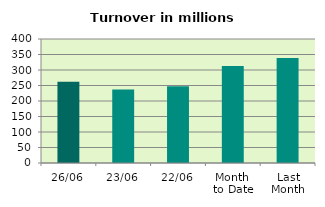
| Category | Series 0 |
|---|---|
| 26/06 | 262.001 |
| 23/06 | 237.398 |
| 22/06 | 247.332 |
| Month 
to Date | 312.796 |
| Last
Month | 338.969 |